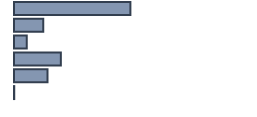
| Category | 46,5 |
|---|---|
| 0 | 48.7 |
| 1 | 12.2 |
| 2 | 5.3 |
| 3 | 19.6 |
| 4 | 14 |
| 5 | 0.1 |